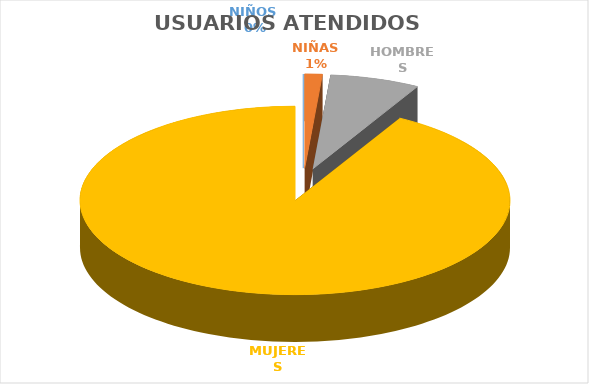
| Category | USUARIOS ATENDIDOS  |
|---|---|
| NIÑOS  | 0 |
| NIÑAS | 7 |
| HOMBRES | 36 |
| MUJERES | 489 |